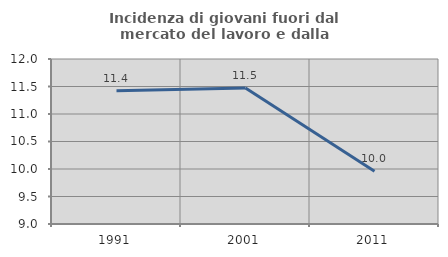
| Category | Incidenza di giovani fuori dal mercato del lavoro e dalla formazione  |
|---|---|
| 1991.0 | 11.425 |
| 2001.0 | 11.473 |
| 2011.0 | 9.957 |